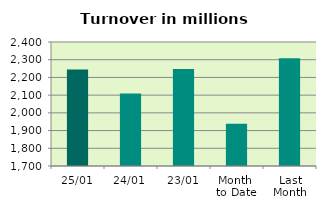
| Category | Series 0 |
|---|---|
| 25/01 | 2244.7 |
| 24/01 | 2109.476 |
| 23/01 | 2247.919 |
| Month 
to Date | 1938.871 |
| Last
Month | 2307.928 |